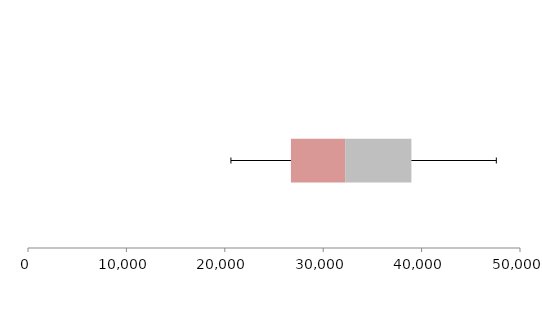
| Category | Series 1 | Series 2 | Series 3 |
|---|---|---|---|
| 0 | 26721.709 | 5514.171 | 6725.69 |